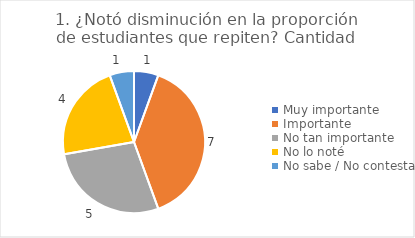
| Category | 1. ¿Notó disminución en la proporción de estudiantes que repiten? |
|---|---|
| Muy importante  | 0.056 |
| Importante  | 0.389 |
| No tan importante  | 0.278 |
| No lo noté  | 0.222 |
| No sabe / No contesta | 0.056 |